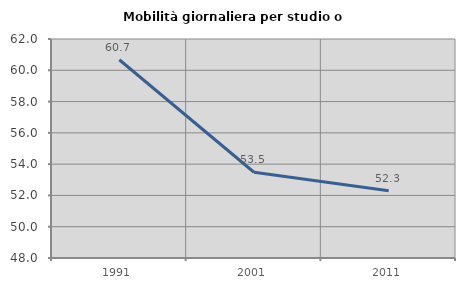
| Category | Mobilità giornaliera per studio o lavoro |
|---|---|
| 1991.0 | 60.672 |
| 2001.0 | 53.481 |
| 2011.0 | 52.306 |